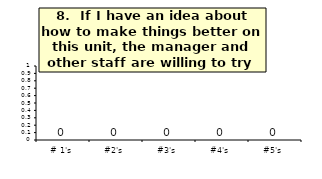
| Category | Q_8 |
|---|---|
| # 1's | 0 |
| #2's | 0 |
| #3's | 0 |
| #4's | 0 |
| #5's | 0 |